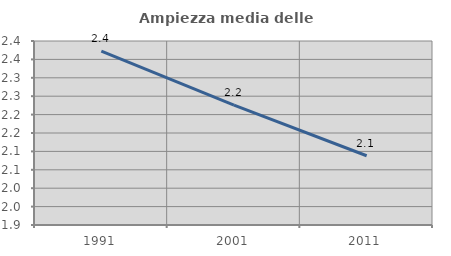
| Category | Ampiezza media delle famiglie |
|---|---|
| 1991.0 | 2.373 |
| 2001.0 | 2.226 |
| 2011.0 | 2.088 |